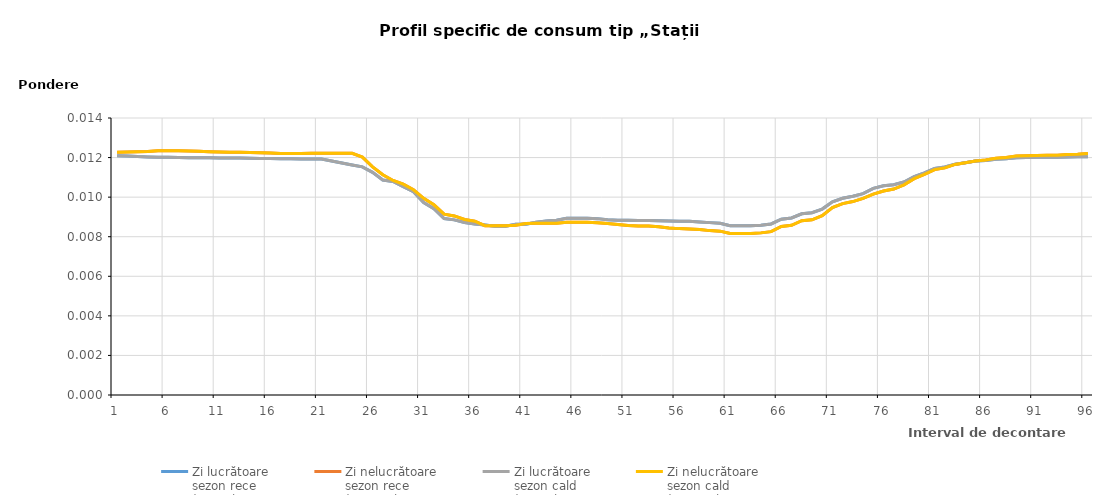
| Category | Zi lucrătoare 
sezon rece
(ZL-SR) | Zi nelucrătoare 
sezon rece
(ZNL-SR) | Zi lucrătoare 
sezon cald
(ZL-SC) | Zi nelucrătoare 
sezon cald
(ZNL-SC) |
|---|---|---|---|---|
| 1.0 | 0.012 | 0.012 | 0.012 | 0.012 |
| 2.0 | 0.012 | 0.012 | 0.012 | 0.012 |
| 3.0 | 0.012 | 0.012 | 0.012 | 0.012 |
| 4.0 | 0.012 | 0.012 | 0.012 | 0.012 |
| 5.0 | 0.012 | 0.012 | 0.012 | 0.012 |
| 6.0 | 0.012 | 0.012 | 0.012 | 0.012 |
| 7.0 | 0.012 | 0.012 | 0.012 | 0.012 |
| 8.0 | 0.012 | 0.012 | 0.012 | 0.012 |
| 9.0 | 0.012 | 0.012 | 0.012 | 0.012 |
| 10.0 | 0.012 | 0.012 | 0.012 | 0.012 |
| 11.0 | 0.012 | 0.012 | 0.012 | 0.012 |
| 12.0 | 0.012 | 0.012 | 0.012 | 0.012 |
| 13.0 | 0.012 | 0.012 | 0.012 | 0.012 |
| 14.0 | 0.012 | 0.012 | 0.012 | 0.012 |
| 15.0 | 0.012 | 0.012 | 0.012 | 0.012 |
| 16.0 | 0.012 | 0.012 | 0.012 | 0.012 |
| 17.0 | 0.012 | 0.012 | 0.012 | 0.012 |
| 18.0 | 0.012 | 0.012 | 0.012 | 0.012 |
| 19.0 | 0.012 | 0.012 | 0.012 | 0.012 |
| 20.0 | 0.012 | 0.012 | 0.012 | 0.012 |
| 21.0 | 0.012 | 0.012 | 0.012 | 0.012 |
| 22.0 | 0.012 | 0.012 | 0.012 | 0.012 |
| 23.0 | 0.012 | 0.012 | 0.012 | 0.012 |
| 24.0 | 0.012 | 0.012 | 0.012 | 0.012 |
| 25.0 | 0.012 | 0.012 | 0.012 | 0.012 |
| 26.0 | 0.011 | 0.012 | 0.011 | 0.012 |
| 27.0 | 0.011 | 0.011 | 0.011 | 0.011 |
| 28.0 | 0.011 | 0.011 | 0.011 | 0.011 |
| 29.0 | 0.011 | 0.011 | 0.011 | 0.011 |
| 30.0 | 0.01 | 0.01 | 0.01 | 0.01 |
| 31.0 | 0.01 | 0.01 | 0.01 | 0.01 |
| 32.0 | 0.009 | 0.01 | 0.009 | 0.01 |
| 33.0 | 0.009 | 0.009 | 0.009 | 0.009 |
| 34.0 | 0.009 | 0.009 | 0.009 | 0.009 |
| 35.0 | 0.009 | 0.009 | 0.009 | 0.009 |
| 36.0 | 0.009 | 0.009 | 0.009 | 0.009 |
| 37.0 | 0.009 | 0.009 | 0.009 | 0.009 |
| 38.0 | 0.009 | 0.009 | 0.009 | 0.009 |
| 39.0 | 0.009 | 0.009 | 0.009 | 0.009 |
| 40.0 | 0.009 | 0.009 | 0.009 | 0.009 |
| 41.0 | 0.009 | 0.009 | 0.009 | 0.009 |
| 42.0 | 0.009 | 0.009 | 0.009 | 0.009 |
| 43.0 | 0.009 | 0.009 | 0.009 | 0.009 |
| 44.0 | 0.009 | 0.009 | 0.009 | 0.009 |
| 45.0 | 0.009 | 0.009 | 0.009 | 0.009 |
| 46.0 | 0.009 | 0.009 | 0.009 | 0.009 |
| 47.0 | 0.009 | 0.009 | 0.009 | 0.009 |
| 48.0 | 0.009 | 0.009 | 0.009 | 0.009 |
| 49.0 | 0.009 | 0.009 | 0.009 | 0.009 |
| 50.0 | 0.009 | 0.009 | 0.009 | 0.009 |
| 51.0 | 0.009 | 0.009 | 0.009 | 0.009 |
| 52.0 | 0.009 | 0.009 | 0.009 | 0.009 |
| 53.0 | 0.009 | 0.009 | 0.009 | 0.009 |
| 54.0 | 0.009 | 0.009 | 0.009 | 0.009 |
| 55.0 | 0.009 | 0.008 | 0.009 | 0.008 |
| 56.0 | 0.009 | 0.008 | 0.009 | 0.008 |
| 57.0 | 0.009 | 0.008 | 0.009 | 0.008 |
| 58.0 | 0.009 | 0.008 | 0.009 | 0.008 |
| 59.0 | 0.009 | 0.008 | 0.009 | 0.008 |
| 60.0 | 0.009 | 0.008 | 0.009 | 0.008 |
| 61.0 | 0.009 | 0.008 | 0.009 | 0.008 |
| 62.0 | 0.009 | 0.008 | 0.009 | 0.008 |
| 63.0 | 0.009 | 0.008 | 0.009 | 0.008 |
| 64.0 | 0.009 | 0.008 | 0.009 | 0.008 |
| 65.0 | 0.009 | 0.008 | 0.009 | 0.008 |
| 66.0 | 0.009 | 0.009 | 0.009 | 0.009 |
| 67.0 | 0.009 | 0.009 | 0.009 | 0.009 |
| 68.0 | 0.009 | 0.009 | 0.009 | 0.009 |
| 69.0 | 0.009 | 0.009 | 0.009 | 0.009 |
| 70.0 | 0.009 | 0.009 | 0.009 | 0.009 |
| 71.0 | 0.01 | 0.009 | 0.01 | 0.009 |
| 72.0 | 0.01 | 0.01 | 0.01 | 0.01 |
| 73.0 | 0.01 | 0.01 | 0.01 | 0.01 |
| 74.0 | 0.01 | 0.01 | 0.01 | 0.01 |
| 75.0 | 0.01 | 0.01 | 0.01 | 0.01 |
| 76.0 | 0.011 | 0.01 | 0.011 | 0.01 |
| 77.0 | 0.011 | 0.01 | 0.011 | 0.01 |
| 78.0 | 0.011 | 0.011 | 0.011 | 0.011 |
| 79.0 | 0.011 | 0.011 | 0.011 | 0.011 |
| 80.0 | 0.011 | 0.011 | 0.011 | 0.011 |
| 81.0 | 0.011 | 0.011 | 0.011 | 0.011 |
| 82.0 | 0.012 | 0.011 | 0.012 | 0.011 |
| 83.0 | 0.012 | 0.012 | 0.012 | 0.012 |
| 84.0 | 0.012 | 0.012 | 0.012 | 0.012 |
| 85.0 | 0.012 | 0.012 | 0.012 | 0.012 |
| 86.0 | 0.012 | 0.012 | 0.012 | 0.012 |
| 87.0 | 0.012 | 0.012 | 0.012 | 0.012 |
| 88.0 | 0.012 | 0.012 | 0.012 | 0.012 |
| 89.0 | 0.012 | 0.012 | 0.012 | 0.012 |
| 90.0 | 0.012 | 0.012 | 0.012 | 0.012 |
| 91.0 | 0.012 | 0.012 | 0.012 | 0.012 |
| 92.0 | 0.012 | 0.012 | 0.012 | 0.012 |
| 93.0 | 0.012 | 0.012 | 0.012 | 0.012 |
| 94.0 | 0.012 | 0.012 | 0.012 | 0.012 |
| 95.0 | 0.012 | 0.012 | 0.012 | 0.012 |
| 96.0 | 0.012 | 0.012 | 0.012 | 0.012 |